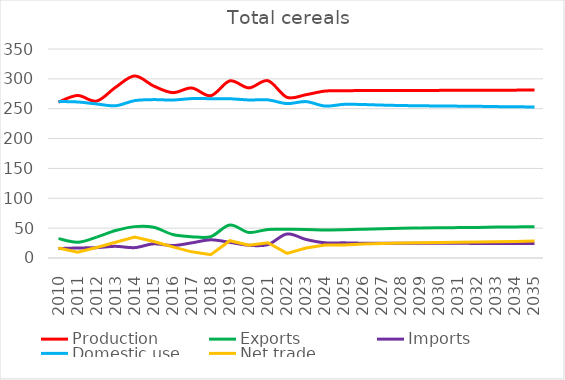
| Category |  Production  |  Exports  |  Imports  |  Domestic use  |  Net trade  |
|---|---|---|---|---|---|
| 2010.0 | 261.04 | 32.431 | 15.825 | 262.025 | 16.606 |
| 2011.0 | 272.175 | 26.45 | 16.783 | 261.312 | 9.668 |
| 2012.0 | 262.786 | 35.001 | 17.352 | 257.957 | 17.649 |
| 2013.0 | 285.905 | 45.962 | 19.531 | 254.965 | 26.431 |
| 2014.0 | 304.89 | 52.537 | 17.344 | 263.53 | 35.193 |
| 2015.0 | 287.995 | 51.364 | 23.734 | 265.236 | 27.63 |
| 2016.0 | 276.914 | 39.389 | 20.844 | 264.54 | 18.545 |
| 2017.0 | 284.699 | 35.67 | 25.348 | 266.947 | 10.322 |
| 2018.0 | 271.769 | 35.858 | 30.438 | 266.798 | 5.42 |
| 2019.0 | 296.611 | 55.11 | 26.166 | 266.682 | 28.945 |
| 2020.0 | 284.856 | 42.872 | 21.358 | 264.658 | 21.514 |
| 2021.0 | 296.872 | 47.893 | 22.412 | 264.853 | 25.481 |
| 2022.0 | 269.102 | 47.949 | 40.253 | 258.572 | 7.696 |
| 2023.0 | 273.462 | 47.84 | 31.025 | 261.88 | 16.815 |
| 2024.0 | 279.566 | 47.026 | 25.458 | 254.465 | 21.568 |
| 2025.0 | 279.988 | 47.336 | 25.38 | 257.338 | 21.956 |
| 2026.0 | 280.529 | 48.105 | 24.743 | 257.003 | 23.362 |
| 2027.0 | 280.369 | 49.024 | 24.692 | 256.055 | 24.332 |
| 2028.0 | 280.455 | 49.781 | 24.674 | 255.319 | 25.108 |
| 2029.0 | 280.591 | 50.22 | 24.628 | 254.913 | 25.592 |
| 2030.0 | 280.709 | 50.621 | 24.578 | 254.555 | 26.043 |
| 2031.0 | 280.841 | 50.945 | 24.521 | 254.317 | 26.424 |
| 2032.0 | 280.918 | 51.256 | 24.463 | 254.051 | 26.793 |
| 2033.0 | 281.024 | 51.777 | 24.381 | 253.529 | 27.396 |
| 2034.0 | 281.12 | 52.079 | 24.311 | 253.251 | 27.768 |
| 2035.0 | 281.204 | 52.504 | 24.231 | 252.876 | 28.272 |